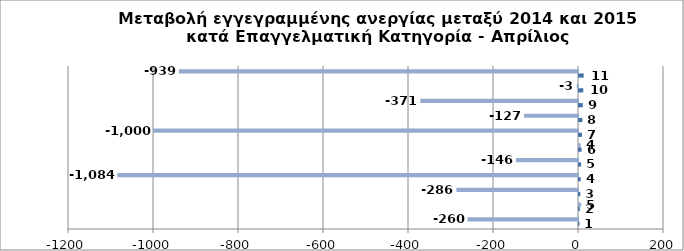
| Category | Series 0 | Series 1 |
|---|---|---|
| 0 | 1 | -260 |
| 1 | 2 | 5 |
| 2 | 3 | -286 |
| 3 | 4 | -1084 |
| 4 | 5 | -146 |
| 5 | 6 | 4 |
| 6 | 7 | -1000 |
| 7 | 8 | -127 |
| 8 | 9 | -371 |
| 9 | 10 | -3 |
| 10 | 11 | -939 |